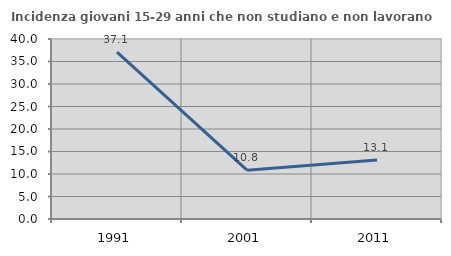
| Category | Incidenza giovani 15-29 anni che non studiano e non lavorano  |
|---|---|
| 1991.0 | 37.097 |
| 2001.0 | 10.847 |
| 2011.0 | 13.103 |